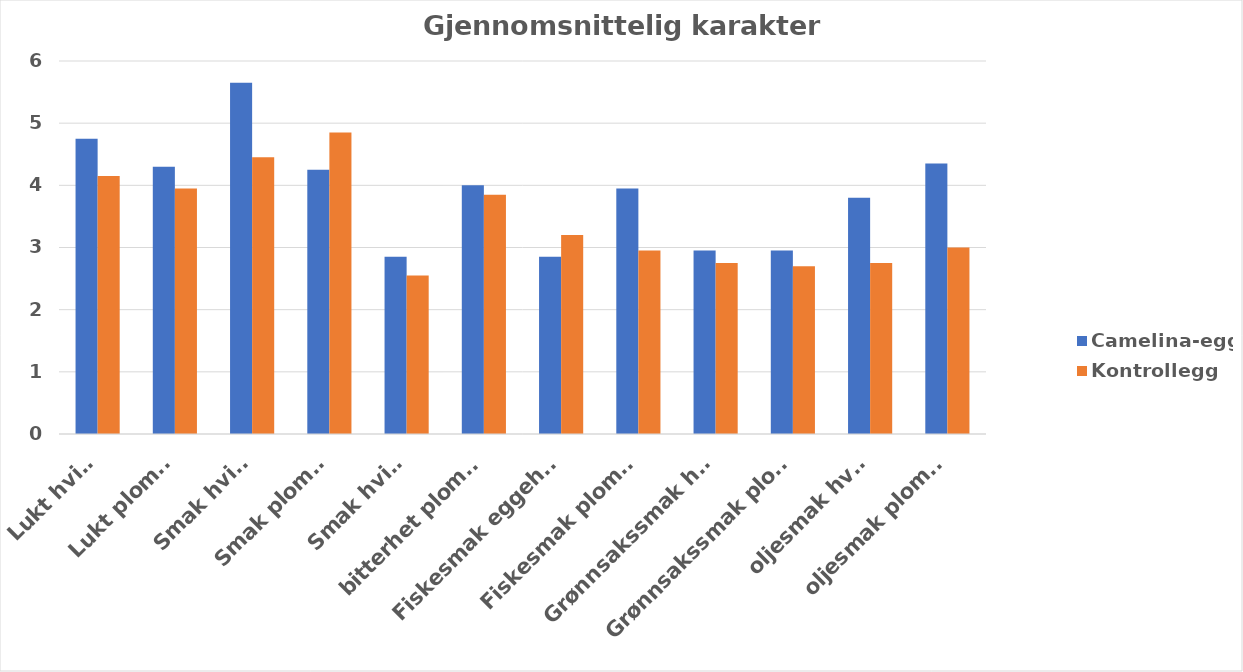
| Category | Camelina-egg | Kontrollegg |
|---|---|---|
| Lukt hvite | 4.75 | 4.15 |
| Lukt plomme | 4.3 | 3.95 |
| Smak hvite | 5.65 | 4.45 |
| Smak plomme | 4.25 | 4.85 |
| Smak hvite | 2.85 | 2.55 |
| bitterhet plomme | 4 | 3.85 |
| Fiskesmak eggehvite | 2.85 | 3.2 |
| Fiskesmak plomme | 3.95 | 2.95 |
| Grønnsakssmak hvite | 2.95 | 2.75 |
| Grønnsakssmak plomme | 2.95 | 2.7 |
| oljesmak hvite | 3.8 | 2.75 |
| oljesmak plomme | 4.35 | 3 |